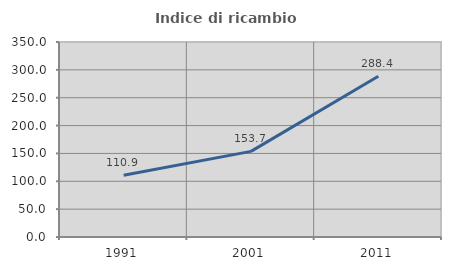
| Category | Indice di ricambio occupazionale  |
|---|---|
| 1991.0 | 110.926 |
| 2001.0 | 153.717 |
| 2011.0 | 288.433 |